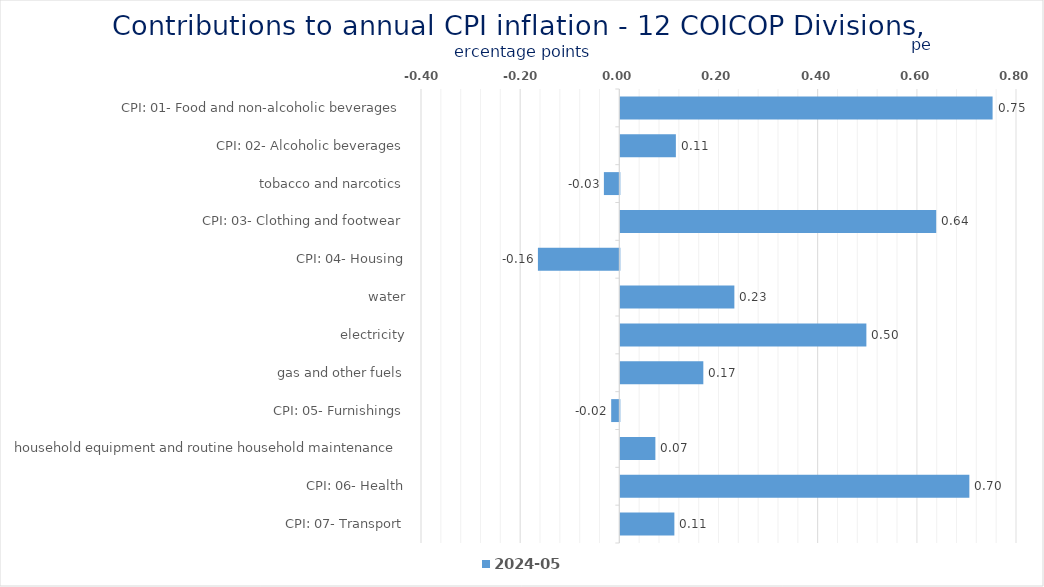
| Category | 2024-05 |
|---|---|
| CPI: 01- Food and non-alcoholic beverages | 0.751 |
| CPI: 02- Alcoholic beverages, tobacco and narcotics | 0.112 |
| CPI: 03- Clothing and footwear | -0.031 |
| CPI: 04- Housing, water, electricity, gas and other fuels | 0.637 |
| CPI: 05- Furnishings, household equipment and routine household maintenance | -0.164 |
| CPI: 06- Health | 0.23 |
| CPI: 07- Transport | 0.496 |
| CPI: 08- Communication | 0.167 |
| CPI: 09- Recreation and culture | -0.016 |
| CPI: 10- Education | 0.071 |
| CPI: 11- Restaurants and hotels | 0.704 |
| CPI: 12- Miscellaneous goods and services | 0.109 |